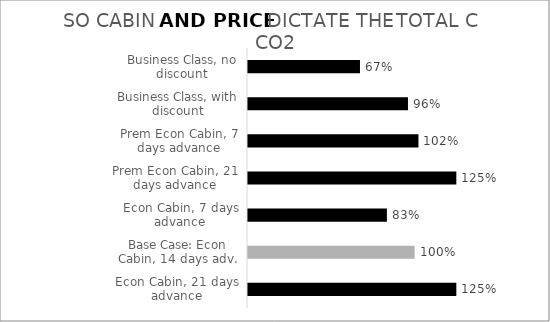
| Category | CO2 kg as % of Base Case |
|---|---|
| Econ Cabin, 21 days advance | 1.25 |
| Base Case: Econ Cabin, 14 days adv. | 1 |
| Econ Cabin, 7 days advance | 0.833 |
| Prem Econ Cabin, 21 days advance | 1.25 |
| Prem Econ Cabin, 7 days advance | 1.023 |
| Business Class, with discount | 0.96 |
| Business Class, no discount | 0.672 |